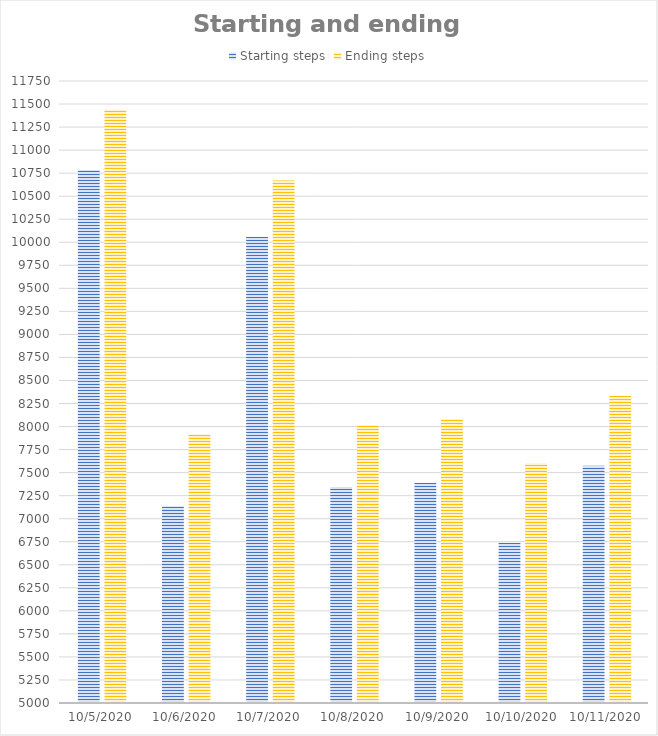
| Category | Starting steps | Ending steps |
|---|---|---|
| 10/5/20 | 10783 | 11440 |
| 10/6/20 | 7136 | 7913 |
| 10/7/20 | 10061 | 10670 |
| 10/8/20 | 7344 | 8014 |
| 10/9/20 | 7389 | 8080 |
| 10/10/20 | 6740 | 7603 |
| 10/11/20 | 7575 | 8333 |